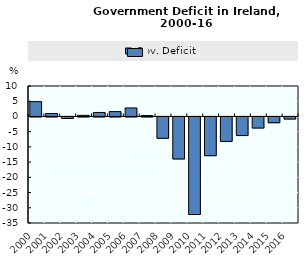
| Category | Gov. Deficit |
|---|---|
| 2000.0 | 4.87 |
| 2001.0 | 0.97 |
| 2002.0 | -0.51 |
| 2003.0 | 0.36 |
| 2004.0 | 1.31 |
| 2005.0 | 1.59 |
| 2006.0 | 2.79 |
| 2007.0 | 0.29 |
| 2008.0 | -7 |
| 2009.0 | -13.8 |
| 2010.0 | -32.05 |
| 2011.0 | -12.73 |
| 2012.0 | -8.04 |
| 2013.0 | -6.11 |
| 2014.0 | -3.65 |
| 2015.0 | -1.9 |
| 2016.0 | -0.69 |